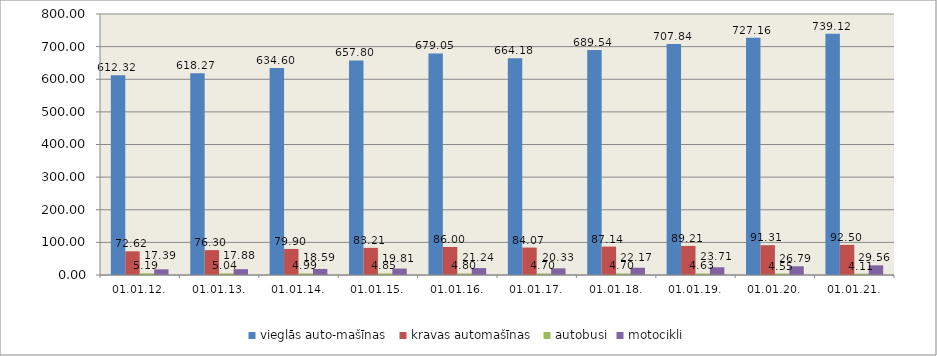
| Category | vieglās auto-mašīnas | kravas automašīnas | autobusi | motocikli |
|---|---|---|---|---|
| 01.01.12. | 612.321 | 72.622 | 5.186 | 17.385 |
| 01.01.13. | 618.274 | 76.303 | 5.044 | 17.879 |
| 01.01.14. | 634.603 | 79.899 | 4.989 | 18.587 |
| 01.01.15. | 657.799 | 83.205 | 4.845 | 19.807 |
| 01.01.16. | 679.048 | 85.998 | 4.797 | 21.241 |
| 01.01.17. | 664.177 | 84.067 | 4.696 | 20.329 |
| 01.01.18. | 689.536 | 87.143 | 4.701 | 22.166 |
| 01.01.19. | 707.841 | 89.211 | 4.632 | 23.713 |
| 01.01.20. | 727.164 | 91.311 | 4.549 | 26.785 |
| 01.01.21. | 739.124 | 92.499 | 4.105 | 29.561 |